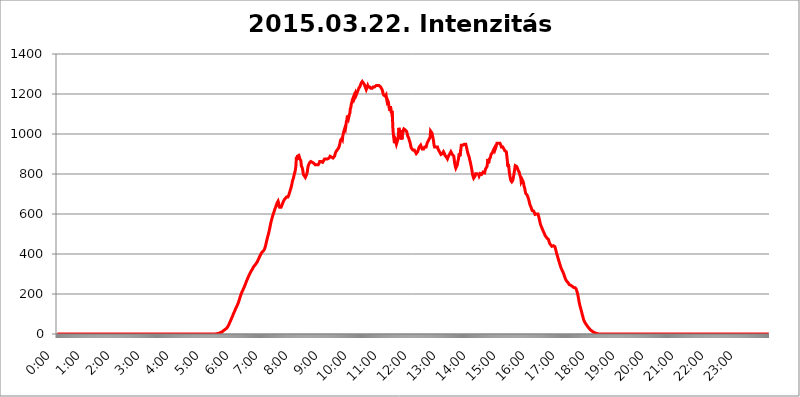
| Category | 2015.03.22. Intenzitás [W/m^2] |
|---|---|
| 0.0 | -0.256 |
| 0.0006944444444444445 | -0.256 |
| 0.001388888888888889 | -0.256 |
| 0.0020833333333333333 | -0.256 |
| 0.002777777777777778 | -0.256 |
| 0.003472222222222222 | -0.256 |
| 0.004166666666666667 | -0.256 |
| 0.004861111111111111 | -0.256 |
| 0.005555555555555556 | -0.256 |
| 0.0062499999999999995 | -0.256 |
| 0.006944444444444444 | -0.256 |
| 0.007638888888888889 | -0.256 |
| 0.008333333333333333 | -0.256 |
| 0.009027777777777779 | -0.256 |
| 0.009722222222222222 | -0.256 |
| 0.010416666666666666 | -0.256 |
| 0.011111111111111112 | -0.256 |
| 0.011805555555555555 | -0.256 |
| 0.012499999999999999 | -0.256 |
| 0.013194444444444444 | -0.256 |
| 0.013888888888888888 | -0.256 |
| 0.014583333333333332 | -0.256 |
| 0.015277777777777777 | -0.256 |
| 0.015972222222222224 | -0.256 |
| 0.016666666666666666 | -0.256 |
| 0.017361111111111112 | -0.256 |
| 0.018055555555555557 | -0.256 |
| 0.01875 | -0.256 |
| 0.019444444444444445 | -0.256 |
| 0.02013888888888889 | -0.256 |
| 0.020833333333333332 | -0.256 |
| 0.02152777777777778 | -0.256 |
| 0.022222222222222223 | -0.256 |
| 0.02291666666666667 | -0.256 |
| 0.02361111111111111 | -0.256 |
| 0.024305555555555556 | -0.256 |
| 0.024999999999999998 | -0.256 |
| 0.025694444444444447 | -0.256 |
| 0.02638888888888889 | -0.256 |
| 0.027083333333333334 | -0.256 |
| 0.027777777777777776 | -0.256 |
| 0.02847222222222222 | -0.256 |
| 0.029166666666666664 | -0.256 |
| 0.029861111111111113 | -0.256 |
| 0.030555555555555555 | -0.256 |
| 0.03125 | -0.256 |
| 0.03194444444444445 | -0.256 |
| 0.03263888888888889 | -0.256 |
| 0.03333333333333333 | -0.256 |
| 0.034027777777777775 | -0.256 |
| 0.034722222222222224 | -0.256 |
| 0.035416666666666666 | -0.256 |
| 0.036111111111111115 | -0.256 |
| 0.03680555555555556 | -0.256 |
| 0.0375 | -0.256 |
| 0.03819444444444444 | -0.256 |
| 0.03888888888888889 | -0.256 |
| 0.03958333333333333 | -0.256 |
| 0.04027777777777778 | -0.256 |
| 0.04097222222222222 | -0.256 |
| 0.041666666666666664 | -0.256 |
| 0.042361111111111106 | -0.256 |
| 0.04305555555555556 | -0.256 |
| 0.043750000000000004 | -0.256 |
| 0.044444444444444446 | -0.256 |
| 0.04513888888888889 | -0.256 |
| 0.04583333333333334 | -0.256 |
| 0.04652777777777778 | -0.256 |
| 0.04722222222222222 | -0.256 |
| 0.04791666666666666 | -0.256 |
| 0.04861111111111111 | -0.256 |
| 0.049305555555555554 | -0.256 |
| 0.049999999999999996 | -0.256 |
| 0.05069444444444445 | -0.256 |
| 0.051388888888888894 | -0.256 |
| 0.052083333333333336 | -0.256 |
| 0.05277777777777778 | -0.256 |
| 0.05347222222222222 | -0.256 |
| 0.05416666666666667 | -0.256 |
| 0.05486111111111111 | -0.256 |
| 0.05555555555555555 | -0.256 |
| 0.05625 | -0.256 |
| 0.05694444444444444 | -0.256 |
| 0.057638888888888885 | -0.256 |
| 0.05833333333333333 | -0.256 |
| 0.05902777777777778 | -0.256 |
| 0.059722222222222225 | -0.256 |
| 0.06041666666666667 | -0.256 |
| 0.061111111111111116 | -0.256 |
| 0.06180555555555556 | -0.256 |
| 0.0625 | -0.256 |
| 0.06319444444444444 | -0.256 |
| 0.06388888888888888 | -0.256 |
| 0.06458333333333334 | -0.256 |
| 0.06527777777777778 | -0.256 |
| 0.06597222222222222 | -0.256 |
| 0.06666666666666667 | -0.256 |
| 0.06736111111111111 | -0.256 |
| 0.06805555555555555 | -0.256 |
| 0.06874999999999999 | -0.256 |
| 0.06944444444444443 | -0.256 |
| 0.07013888888888889 | -0.256 |
| 0.07083333333333333 | -0.256 |
| 0.07152777777777779 | -0.256 |
| 0.07222222222222223 | -0.256 |
| 0.07291666666666667 | -0.256 |
| 0.07361111111111111 | -0.256 |
| 0.07430555555555556 | -0.256 |
| 0.075 | -0.256 |
| 0.07569444444444444 | -0.256 |
| 0.0763888888888889 | -0.256 |
| 0.07708333333333334 | -0.256 |
| 0.07777777777777778 | -0.256 |
| 0.07847222222222222 | -0.256 |
| 0.07916666666666666 | -0.256 |
| 0.0798611111111111 | -0.256 |
| 0.08055555555555556 | -0.256 |
| 0.08125 | -0.256 |
| 0.08194444444444444 | -0.256 |
| 0.08263888888888889 | -0.256 |
| 0.08333333333333333 | -0.256 |
| 0.08402777777777777 | -0.256 |
| 0.08472222222222221 | -0.256 |
| 0.08541666666666665 | -0.256 |
| 0.08611111111111112 | -0.256 |
| 0.08680555555555557 | -0.256 |
| 0.08750000000000001 | -0.256 |
| 0.08819444444444445 | -0.256 |
| 0.08888888888888889 | -0.256 |
| 0.08958333333333333 | -0.256 |
| 0.09027777777777778 | -0.256 |
| 0.09097222222222222 | -0.256 |
| 0.09166666666666667 | -0.256 |
| 0.09236111111111112 | -0.256 |
| 0.09305555555555556 | -0.256 |
| 0.09375 | -0.256 |
| 0.09444444444444444 | -0.256 |
| 0.09513888888888888 | -0.256 |
| 0.09583333333333333 | -0.256 |
| 0.09652777777777777 | -0.256 |
| 0.09722222222222222 | -0.256 |
| 0.09791666666666667 | -0.256 |
| 0.09861111111111111 | -0.256 |
| 0.09930555555555555 | -0.256 |
| 0.09999999999999999 | -0.256 |
| 0.10069444444444443 | -0.256 |
| 0.1013888888888889 | -0.256 |
| 0.10208333333333335 | -0.256 |
| 0.10277777777777779 | -0.256 |
| 0.10347222222222223 | -0.256 |
| 0.10416666666666667 | -0.256 |
| 0.10486111111111111 | -0.256 |
| 0.10555555555555556 | -0.256 |
| 0.10625 | -0.256 |
| 0.10694444444444444 | -0.256 |
| 0.1076388888888889 | -0.256 |
| 0.10833333333333334 | -0.256 |
| 0.10902777777777778 | -0.256 |
| 0.10972222222222222 | -0.256 |
| 0.1111111111111111 | -0.256 |
| 0.11180555555555556 | -0.256 |
| 0.11180555555555556 | -0.256 |
| 0.1125 | -0.256 |
| 0.11319444444444444 | -0.256 |
| 0.11388888888888889 | -0.256 |
| 0.11458333333333333 | -0.256 |
| 0.11527777777777777 | -0.256 |
| 0.11597222222222221 | -0.256 |
| 0.11666666666666665 | -0.256 |
| 0.1173611111111111 | -0.256 |
| 0.11805555555555557 | -0.256 |
| 0.11944444444444445 | -0.256 |
| 0.12013888888888889 | -0.256 |
| 0.12083333333333333 | -0.256 |
| 0.12152777777777778 | -0.256 |
| 0.12222222222222223 | -0.256 |
| 0.12291666666666667 | -0.256 |
| 0.12291666666666667 | -0.256 |
| 0.12361111111111112 | -0.256 |
| 0.12430555555555556 | -0.256 |
| 0.125 | -0.256 |
| 0.12569444444444444 | -0.256 |
| 0.12638888888888888 | -0.256 |
| 0.12708333333333333 | -0.256 |
| 0.16875 | -0.256 |
| 0.12847222222222224 | -0.256 |
| 0.12916666666666668 | -0.256 |
| 0.12986111111111112 | -0.256 |
| 0.13055555555555556 | -0.256 |
| 0.13125 | -0.256 |
| 0.13194444444444445 | -0.256 |
| 0.1326388888888889 | -0.256 |
| 0.13333333333333333 | -0.256 |
| 0.13402777777777777 | -0.256 |
| 0.13402777777777777 | -0.256 |
| 0.13472222222222222 | -0.256 |
| 0.13541666666666666 | -0.256 |
| 0.1361111111111111 | -0.256 |
| 0.13749999999999998 | -0.256 |
| 0.13819444444444443 | -0.256 |
| 0.1388888888888889 | -0.256 |
| 0.13958333333333334 | -0.256 |
| 0.14027777777777778 | -0.256 |
| 0.14097222222222222 | -0.256 |
| 0.14166666666666666 | -0.256 |
| 0.1423611111111111 | -0.256 |
| 0.14305555555555557 | -0.256 |
| 0.14375000000000002 | -0.256 |
| 0.14444444444444446 | -0.256 |
| 0.1451388888888889 | -0.256 |
| 0.1451388888888889 | -0.256 |
| 0.14652777777777778 | -0.256 |
| 0.14722222222222223 | -0.256 |
| 0.14791666666666667 | -0.256 |
| 0.1486111111111111 | -0.256 |
| 0.14930555555555555 | -0.256 |
| 0.15 | -0.256 |
| 0.15069444444444444 | -0.256 |
| 0.15138888888888888 | -0.256 |
| 0.15208333333333332 | -0.256 |
| 0.15277777777777776 | -0.256 |
| 0.15347222222222223 | -0.256 |
| 0.15416666666666667 | -0.256 |
| 0.15486111111111112 | -0.256 |
| 0.15555555555555556 | -0.256 |
| 0.15625 | -0.256 |
| 0.15694444444444444 | -0.256 |
| 0.15763888888888888 | -0.256 |
| 0.15833333333333333 | -0.256 |
| 0.15902777777777777 | -0.256 |
| 0.15972222222222224 | -0.256 |
| 0.16041666666666668 | -0.256 |
| 0.16111111111111112 | -0.256 |
| 0.16180555555555556 | -0.256 |
| 0.1625 | -0.256 |
| 0.16319444444444445 | -0.256 |
| 0.1638888888888889 | -0.256 |
| 0.16458333333333333 | -0.256 |
| 0.16527777777777777 | -0.256 |
| 0.16597222222222222 | -0.256 |
| 0.16666666666666666 | -0.256 |
| 0.1673611111111111 | -0.256 |
| 0.16805555555555554 | -0.256 |
| 0.16874999999999998 | -0.256 |
| 0.16944444444444443 | -0.256 |
| 0.17013888888888887 | -0.256 |
| 0.1708333333333333 | -0.256 |
| 0.17152777777777775 | -0.256 |
| 0.17222222222222225 | -0.256 |
| 0.1729166666666667 | -0.256 |
| 0.17361111111111113 | -0.256 |
| 0.17430555555555557 | -0.256 |
| 0.17500000000000002 | -0.256 |
| 0.17569444444444446 | -0.256 |
| 0.1763888888888889 | -0.256 |
| 0.17708333333333334 | -0.256 |
| 0.17777777777777778 | -0.256 |
| 0.17847222222222223 | -0.256 |
| 0.17916666666666667 | -0.256 |
| 0.1798611111111111 | -0.256 |
| 0.18055555555555555 | -0.256 |
| 0.18125 | -0.256 |
| 0.18194444444444444 | -0.256 |
| 0.1826388888888889 | -0.256 |
| 0.18333333333333335 | -0.256 |
| 0.1840277777777778 | -0.256 |
| 0.18472222222222223 | -0.256 |
| 0.18541666666666667 | -0.256 |
| 0.18611111111111112 | -0.256 |
| 0.18680555555555556 | -0.256 |
| 0.1875 | -0.256 |
| 0.18819444444444444 | -0.256 |
| 0.18888888888888888 | -0.256 |
| 0.18958333333333333 | -0.256 |
| 0.19027777777777777 | -0.256 |
| 0.1909722222222222 | -0.256 |
| 0.19166666666666665 | -0.256 |
| 0.19236111111111112 | -0.256 |
| 0.19305555555555554 | -0.256 |
| 0.19375 | -0.256 |
| 0.19444444444444445 | -0.256 |
| 0.1951388888888889 | -0.256 |
| 0.19583333333333333 | -0.256 |
| 0.19652777777777777 | -0.256 |
| 0.19722222222222222 | -0.256 |
| 0.19791666666666666 | -0.256 |
| 0.1986111111111111 | -0.256 |
| 0.19930555555555554 | -0.256 |
| 0.19999999999999998 | -0.256 |
| 0.20069444444444443 | -0.256 |
| 0.20138888888888887 | -0.256 |
| 0.2020833333333333 | -0.256 |
| 0.2027777777777778 | -0.256 |
| 0.2034722222222222 | -0.256 |
| 0.2041666666666667 | -0.256 |
| 0.20486111111111113 | -0.256 |
| 0.20555555555555557 | -0.256 |
| 0.20625000000000002 | -0.256 |
| 0.20694444444444446 | -0.256 |
| 0.2076388888888889 | -0.256 |
| 0.20833333333333334 | -0.256 |
| 0.20902777777777778 | -0.256 |
| 0.20972222222222223 | -0.256 |
| 0.21041666666666667 | -0.256 |
| 0.2111111111111111 | -0.256 |
| 0.21180555555555555 | -0.256 |
| 0.2125 | -0.256 |
| 0.21319444444444444 | -0.256 |
| 0.2138888888888889 | -0.256 |
| 0.21458333333333335 | -0.256 |
| 0.2152777777777778 | -0.256 |
| 0.21597222222222223 | -0.256 |
| 0.21666666666666667 | -0.256 |
| 0.21736111111111112 | -0.256 |
| 0.21805555555555556 | -0.256 |
| 0.21875 | -0.256 |
| 0.21944444444444444 | -0.256 |
| 0.22013888888888888 | -0.256 |
| 0.22083333333333333 | -0.256 |
| 0.22152777777777777 | -0.256 |
| 0.2222222222222222 | 1.09 |
| 0.22291666666666665 | 1.09 |
| 0.2236111111111111 | 1.09 |
| 0.22430555555555556 | 1.09 |
| 0.225 | 2.439 |
| 0.22569444444444445 | 2.439 |
| 0.2263888888888889 | 3.791 |
| 0.22708333333333333 | 3.791 |
| 0.22777777777777777 | 5.146 |
| 0.22847222222222222 | 6.503 |
| 0.22916666666666666 | 7.862 |
| 0.2298611111111111 | 9.225 |
| 0.23055555555555554 | 9.225 |
| 0.23124999999999998 | 10.589 |
| 0.23194444444444443 | 13.325 |
| 0.23263888888888887 | 14.696 |
| 0.2333333333333333 | 17.444 |
| 0.2340277777777778 | 18.822 |
| 0.2347222222222222 | 21.582 |
| 0.2354166666666667 | 22.965 |
| 0.23611111111111113 | 24.35 |
| 0.23680555555555557 | 27.124 |
| 0.23750000000000002 | 28.514 |
| 0.23819444444444446 | 31.297 |
| 0.2388888888888889 | 35.483 |
| 0.23958333333333334 | 39.68 |
| 0.24027777777777778 | 43.886 |
| 0.24097222222222223 | 48.1 |
| 0.24166666666666667 | 55.139 |
| 0.2423611111111111 | 60.778 |
| 0.24305555555555555 | 66.423 |
| 0.24375 | 72.069 |
| 0.24444444444444446 | 77.715 |
| 0.24513888888888888 | 83.356 |
| 0.24583333333333335 | 88.991 |
| 0.2465277777777778 | 96.022 |
| 0.24722222222222223 | 101.634 |
| 0.24791666666666667 | 107.232 |
| 0.24861111111111112 | 112.814 |
| 0.24930555555555556 | 118.378 |
| 0.25 | 125.304 |
| 0.25069444444444444 | 129.444 |
| 0.2513888888888889 | 134.943 |
| 0.2520833333333333 | 140.417 |
| 0.25277777777777777 | 145.865 |
| 0.2534722222222222 | 151.286 |
| 0.25416666666666665 | 159.364 |
| 0.2548611111111111 | 166.044 |
| 0.2555555555555556 | 173.996 |
| 0.25625000000000003 | 181.877 |
| 0.2569444444444445 | 189.685 |
| 0.2576388888888889 | 197.419 |
| 0.25833333333333336 | 203.807 |
| 0.2590277777777778 | 210.144 |
| 0.25972222222222224 | 215.177 |
| 0.2604166666666667 | 220.177 |
| 0.2611111111111111 | 225.146 |
| 0.26180555555555557 | 231.313 |
| 0.2625 | 237.433 |
| 0.26319444444444445 | 243.507 |
| 0.2638888888888889 | 249.538 |
| 0.26458333333333334 | 256.722 |
| 0.2652777777777778 | 262.666 |
| 0.2659722222222222 | 268.576 |
| 0.26666666666666666 | 274.454 |
| 0.2673611111111111 | 280.304 |
| 0.26805555555555555 | 286.13 |
| 0.26875 | 290.777 |
| 0.26944444444444443 | 296.571 |
| 0.2701388888888889 | 301.198 |
| 0.2708333333333333 | 306.974 |
| 0.27152777777777776 | 311.594 |
| 0.2722222222222222 | 316.215 |
| 0.27291666666666664 | 320.84 |
| 0.2736111111111111 | 324.314 |
| 0.2743055555555555 | 328.955 |
| 0.27499999999999997 | 333.608 |
| 0.27569444444444446 | 337.109 |
| 0.27638888888888885 | 340.62 |
| 0.27708333333333335 | 344.144 |
| 0.2777777777777778 | 346.501 |
| 0.27847222222222223 | 350.049 |
| 0.2791666666666667 | 353.613 |
| 0.2798611111111111 | 357.196 |
| 0.28055555555555556 | 360.798 |
| 0.28125 | 366.851 |
| 0.28194444444444444 | 371.742 |
| 0.2826388888888889 | 376.682 |
| 0.2833333333333333 | 382.93 |
| 0.28402777777777777 | 387.995 |
| 0.2847222222222222 | 393.122 |
| 0.28541666666666665 | 398.318 |
| 0.28611111111111115 | 403.587 |
| 0.28680555555555554 | 406.25 |
| 0.28750000000000003 | 410.283 |
| 0.2881944444444445 | 412.998 |
| 0.2888888888888889 | 414.364 |
| 0.28958333333333336 | 417.112 |
| 0.2902777777777778 | 421.278 |
| 0.29097222222222224 | 426.916 |
| 0.2916666666666667 | 435.566 |
| 0.2923611111111111 | 444.463 |
| 0.29305555555555557 | 455.184 |
| 0.29375 | 466.302 |
| 0.29444444444444445 | 476.176 |
| 0.2951388888888889 | 486.389 |
| 0.29583333333333334 | 495.176 |
| 0.2965277777777778 | 504.229 |
| 0.2972222222222222 | 515.462 |
| 0.29791666666666666 | 527.122 |
| 0.2986111111111111 | 539.234 |
| 0.29930555555555555 | 551.823 |
| 0.3 | 562.699 |
| 0.30069444444444443 | 571.661 |
| 0.3013888888888889 | 580.866 |
| 0.3020833333333333 | 590.321 |
| 0.30277777777777776 | 597.582 |
| 0.3034722222222222 | 604.992 |
| 0.30416666666666664 | 612.554 |
| 0.3048611111111111 | 620.273 |
| 0.3055555555555555 | 628.152 |
| 0.30624999999999997 | 633.495 |
| 0.3069444444444444 | 641.649 |
| 0.3076388888888889 | 647.179 |
| 0.30833333333333335 | 655.618 |
| 0.3090277777777778 | 658.471 |
| 0.30972222222222223 | 664.234 |
| 0.3104166666666667 | 655.618 |
| 0.3111111111111111 | 638.912 |
| 0.31180555555555556 | 633.495 |
| 0.3125 | 630.814 |
| 0.31319444444444444 | 630.814 |
| 0.3138888888888889 | 633.495 |
| 0.3145833333333333 | 638.912 |
| 0.31527777777777777 | 644.405 |
| 0.3159722222222222 | 652.786 |
| 0.31666666666666665 | 658.471 |
| 0.31736111111111115 | 664.234 |
| 0.31805555555555554 | 667.146 |
| 0.31875000000000003 | 673.03 |
| 0.3194444444444445 | 676.003 |
| 0.3201388888888889 | 678.997 |
| 0.32083333333333336 | 682.011 |
| 0.3215277777777778 | 685.046 |
| 0.32222222222222224 | 682.011 |
| 0.3229166666666667 | 682.011 |
| 0.3236111111111111 | 685.046 |
| 0.32430555555555557 | 691.18 |
| 0.325 | 697.399 |
| 0.32569444444444445 | 706.89 |
| 0.3263888888888889 | 713.328 |
| 0.32708333333333334 | 723.153 |
| 0.3277777777777778 | 729.817 |
| 0.3284722222222222 | 739.988 |
| 0.32916666666666666 | 750.371 |
| 0.3298611111111111 | 764.555 |
| 0.33055555555555555 | 771.794 |
| 0.33125 | 779.134 |
| 0.33194444444444443 | 790.334 |
| 0.3326388888888889 | 801.768 |
| 0.3333333333333333 | 809.522 |
| 0.3340277777777778 | 821.353 |
| 0.3347222222222222 | 841.619 |
| 0.3354166666666667 | 884.274 |
| 0.3361111111111111 | 871.173 |
| 0.3368055555555556 | 888.701 |
| 0.33749999999999997 | 888.701 |
| 0.33819444444444446 | 893.157 |
| 0.33888888888888885 | 893.157 |
| 0.33958333333333335 | 884.274 |
| 0.34027777777777773 | 875.511 |
| 0.34097222222222223 | 871.173 |
| 0.3416666666666666 | 866.865 |
| 0.3423611111111111 | 841.619 |
| 0.3430555555555555 | 845.755 |
| 0.34375 | 829.377 |
| 0.3444444444444445 | 817.382 |
| 0.3451388888888889 | 797.931 |
| 0.3458333333333334 | 794.119 |
| 0.34652777777777777 | 790.334 |
| 0.34722222222222227 | 786.575 |
| 0.34791666666666665 | 782.842 |
| 0.34861111111111115 | 786.575 |
| 0.34930555555555554 | 794.119 |
| 0.35000000000000003 | 797.931 |
| 0.3506944444444444 | 809.522 |
| 0.3513888888888889 | 829.377 |
| 0.3520833333333333 | 841.619 |
| 0.3527777777777778 | 845.755 |
| 0.3534722222222222 | 854.113 |
| 0.3541666666666667 | 854.113 |
| 0.3548611111111111 | 858.335 |
| 0.35555555555555557 | 862.585 |
| 0.35625 | 858.335 |
| 0.35694444444444445 | 862.585 |
| 0.3576388888888889 | 858.335 |
| 0.35833333333333334 | 854.113 |
| 0.3590277777777778 | 854.113 |
| 0.3597222222222222 | 854.113 |
| 0.36041666666666666 | 849.92 |
| 0.3611111111111111 | 849.92 |
| 0.36180555555555555 | 845.755 |
| 0.3625 | 841.619 |
| 0.36319444444444443 | 841.619 |
| 0.3638888888888889 | 845.755 |
| 0.3645833333333333 | 841.619 |
| 0.3652777777777778 | 841.619 |
| 0.3659722222222222 | 845.755 |
| 0.3666666666666667 | 841.619 |
| 0.3673611111111111 | 854.113 |
| 0.3680555555555556 | 862.585 |
| 0.36874999999999997 | 858.335 |
| 0.36944444444444446 | 862.585 |
| 0.37013888888888885 | 862.585 |
| 0.37083333333333335 | 858.335 |
| 0.37152777777777773 | 858.335 |
| 0.37222222222222223 | 858.335 |
| 0.3729166666666666 | 862.585 |
| 0.3736111111111111 | 866.865 |
| 0.3743055555555555 | 871.173 |
| 0.375 | 875.511 |
| 0.3756944444444445 | 875.511 |
| 0.3763888888888889 | 879.878 |
| 0.3770833333333334 | 875.511 |
| 0.37777777777777777 | 875.511 |
| 0.37847222222222227 | 875.511 |
| 0.37916666666666665 | 875.511 |
| 0.37986111111111115 | 875.511 |
| 0.38055555555555554 | 875.511 |
| 0.38125000000000003 | 879.878 |
| 0.3819444444444444 | 884.274 |
| 0.3826388888888889 | 888.701 |
| 0.3833333333333333 | 888.701 |
| 0.3840277777777778 | 888.701 |
| 0.3847222222222222 | 884.274 |
| 0.3854166666666667 | 888.701 |
| 0.3861111111111111 | 884.274 |
| 0.38680555555555557 | 879.878 |
| 0.3875 | 879.878 |
| 0.38819444444444445 | 884.274 |
| 0.3888888888888889 | 888.701 |
| 0.38958333333333334 | 897.643 |
| 0.3902777777777778 | 906.707 |
| 0.3909722222222222 | 911.285 |
| 0.39166666666666666 | 915.893 |
| 0.3923611111111111 | 920.533 |
| 0.39305555555555555 | 920.533 |
| 0.39375 | 925.203 |
| 0.39444444444444443 | 929.905 |
| 0.3951388888888889 | 934.639 |
| 0.3958333333333333 | 939.404 |
| 0.3965277777777778 | 953.892 |
| 0.3972222222222222 | 968.671 |
| 0.3979166666666667 | 973.663 |
| 0.3986111111111111 | 973.663 |
| 0.3993055555555556 | 978.688 |
| 0.39999999999999997 | 973.663 |
| 0.40069444444444446 | 993.965 |
| 0.40138888888888885 | 1004.318 |
| 0.40208333333333335 | 1014.809 |
| 0.40277777777777773 | 1014.809 |
| 0.40347222222222223 | 1030.804 |
| 0.4041666666666666 | 1025.437 |
| 0.4048611111111111 | 1041.644 |
| 0.4055555555555555 | 1063.751 |
| 0.40625 | 1069.368 |
| 0.4069444444444445 | 1092.203 |
| 0.4076388888888889 | 1080.711 |
| 0.4083333333333334 | 1075.021 |
| 0.40902777777777777 | 1086.439 |
| 0.40972222222222227 | 1098.004 |
| 0.41041666666666665 | 1103.843 |
| 0.41111111111111115 | 1127.578 |
| 0.41180555555555554 | 1133.607 |
| 0.41250000000000003 | 1151.928 |
| 0.4131944444444444 | 1158.113 |
| 0.4138888888888889 | 1170.601 |
| 0.4145833333333333 | 1176.905 |
| 0.4152777777777778 | 1176.905 |
| 0.4159722222222222 | 1189.633 |
| 0.4166666666666667 | 1176.905 |
| 0.4173611111111111 | 1183.249 |
| 0.41805555555555557 | 1189.633 |
| 0.41875 | 1202.523 |
| 0.41944444444444445 | 1196.058 |
| 0.4201388888888889 | 1196.058 |
| 0.42083333333333334 | 1209.029 |
| 0.4215277777777778 | 1215.576 |
| 0.4222222222222222 | 1215.576 |
| 0.42291666666666666 | 1228.794 |
| 0.4236111111111111 | 1228.794 |
| 0.42430555555555555 | 1235.465 |
| 0.425 | 1235.465 |
| 0.42569444444444443 | 1248.934 |
| 0.4263888888888889 | 1255.731 |
| 0.4270833333333333 | 1255.731 |
| 0.4277777777777778 | 1262.571 |
| 0.4284722222222222 | 1262.571 |
| 0.4291666666666667 | 1255.731 |
| 0.4298611111111111 | 1255.731 |
| 0.4305555555555556 | 1248.934 |
| 0.43124999999999997 | 1242.179 |
| 0.43194444444444446 | 1242.179 |
| 0.43263888888888885 | 1228.794 |
| 0.43333333333333335 | 1222.164 |
| 0.43402777777777773 | 1228.794 |
| 0.43472222222222223 | 1235.465 |
| 0.4354166666666666 | 1242.179 |
| 0.4361111111111111 | 1235.465 |
| 0.4368055555555555 | 1235.465 |
| 0.4375 | 1235.465 |
| 0.4381944444444445 | 1235.465 |
| 0.4388888888888889 | 1235.465 |
| 0.4395833333333334 | 1228.794 |
| 0.44027777777777777 | 1228.794 |
| 0.44097222222222227 | 1228.794 |
| 0.44166666666666665 | 1228.794 |
| 0.44236111111111115 | 1228.794 |
| 0.44305555555555554 | 1235.465 |
| 0.44375000000000003 | 1235.465 |
| 0.4444444444444444 | 1235.465 |
| 0.4451388888888889 | 1235.465 |
| 0.4458333333333333 | 1235.465 |
| 0.4465277777777778 | 1235.465 |
| 0.4472222222222222 | 1242.179 |
| 0.4479166666666667 | 1242.179 |
| 0.4486111111111111 | 1242.179 |
| 0.44930555555555557 | 1242.179 |
| 0.45 | 1242.179 |
| 0.45069444444444445 | 1242.179 |
| 0.4513888888888889 | 1242.179 |
| 0.45208333333333334 | 1242.179 |
| 0.4527777777777778 | 1242.179 |
| 0.4534722222222222 | 1235.465 |
| 0.45416666666666666 | 1235.465 |
| 0.4548611111111111 | 1235.465 |
| 0.45555555555555555 | 1222.164 |
| 0.45625 | 1215.576 |
| 0.45694444444444443 | 1202.523 |
| 0.4576388888888889 | 1196.058 |
| 0.4583333333333333 | 1196.058 |
| 0.4590277777777778 | 1196.058 |
| 0.4597222222222222 | 1189.633 |
| 0.4604166666666667 | 1189.633 |
| 0.4611111111111111 | 1196.058 |
| 0.4618055555555556 | 1176.905 |
| 0.46249999999999997 | 1164.337 |
| 0.46319444444444446 | 1170.601 |
| 0.46388888888888885 | 1170.601 |
| 0.46458333333333335 | 1158.113 |
| 0.46527777777777773 | 1133.607 |
| 0.46597222222222223 | 1127.578 |
| 0.4666666666666666 | 1115.634 |
| 0.4673611111111111 | 1139.675 |
| 0.4680555555555555 | 1115.634 |
| 0.46875 | 1103.843 |
| 0.4694444444444445 | 1115.634 |
| 0.4701388888888889 | 1080.711 |
| 0.4708333333333334 | 1020.106 |
| 0.47152777777777777 | 993.965 |
| 0.47222222222222227 | 973.663 |
| 0.47291666666666665 | 953.892 |
| 0.47361111111111115 | 958.785 |
| 0.47430555555555554 | 968.671 |
| 0.47500000000000003 | 963.712 |
| 0.4756944444444444 | 949.03 |
| 0.4763888888888889 | 953.892 |
| 0.4770833333333333 | 944.201 |
| 0.4777777777777778 | 973.663 |
| 0.4784722222222222 | 993.965 |
| 0.4791666666666667 | 1030.804 |
| 0.4798611111111111 | 1014.809 |
| 0.48055555555555557 | 978.688 |
| 0.48125 | 1020.106 |
| 0.48194444444444445 | 973.663 |
| 0.4826388888888889 | 993.965 |
| 0.48333333333333334 | 973.663 |
| 0.4840277777777778 | 993.965 |
| 0.4847222222222222 | 1004.318 |
| 0.48541666666666666 | 1020.106 |
| 0.4861111111111111 | 1025.437 |
| 0.48680555555555555 | 1025.437 |
| 0.4875 | 1025.437 |
| 0.48819444444444443 | 1020.106 |
| 0.4888888888888889 | 1020.106 |
| 0.4895833333333333 | 1014.809 |
| 0.4902777777777778 | 1009.546 |
| 0.4909722222222222 | 999.125 |
| 0.4916666666666667 | 988.839 |
| 0.4923611111111111 | 983.747 |
| 0.4930555555555556 | 978.688 |
| 0.49374999999999997 | 968.671 |
| 0.49444444444444446 | 963.712 |
| 0.49513888888888885 | 953.892 |
| 0.49583333333333335 | 939.404 |
| 0.49652777777777773 | 929.905 |
| 0.49722222222222223 | 929.905 |
| 0.4979166666666666 | 925.203 |
| 0.4986111111111111 | 920.533 |
| 0.4993055555555555 | 915.893 |
| 0.5 | 915.893 |
| 0.5006944444444444 | 920.533 |
| 0.5013888888888889 | 915.893 |
| 0.5020833333333333 | 911.285 |
| 0.5027777777777778 | 906.707 |
| 0.5034722222222222 | 902.16 |
| 0.5041666666666667 | 902.16 |
| 0.5048611111111111 | 902.16 |
| 0.5055555555555555 | 911.285 |
| 0.50625 | 920.533 |
| 0.5069444444444444 | 925.203 |
| 0.5076388888888889 | 934.639 |
| 0.5083333333333333 | 929.905 |
| 0.5090277777777777 | 939.404 |
| 0.5097222222222222 | 944.201 |
| 0.5104166666666666 | 944.201 |
| 0.5111111111111112 | 939.404 |
| 0.5118055555555555 | 925.203 |
| 0.5125000000000001 | 920.533 |
| 0.5131944444444444 | 920.533 |
| 0.513888888888889 | 925.203 |
| 0.5145833333333333 | 925.203 |
| 0.5152777777777778 | 934.639 |
| 0.5159722222222222 | 939.404 |
| 0.5166666666666667 | 939.404 |
| 0.517361111111111 | 934.639 |
| 0.5180555555555556 | 944.201 |
| 0.5187499999999999 | 953.892 |
| 0.5194444444444445 | 953.892 |
| 0.5201388888888888 | 963.712 |
| 0.5208333333333334 | 963.712 |
| 0.5215277777777778 | 973.663 |
| 0.5222222222222223 | 978.688 |
| 0.5229166666666667 | 983.747 |
| 0.5236111111111111 | 1014.809 |
| 0.5243055555555556 | 1014.809 |
| 0.525 | 1014.809 |
| 0.5256944444444445 | 1004.318 |
| 0.5263888888888889 | 988.839 |
| 0.5270833333333333 | 978.688 |
| 0.5277777777777778 | 963.712 |
| 0.5284722222222222 | 944.201 |
| 0.5291666666666667 | 934.639 |
| 0.5298611111111111 | 934.639 |
| 0.5305555555555556 | 934.639 |
| 0.53125 | 934.639 |
| 0.5319444444444444 | 929.905 |
| 0.5326388888888889 | 929.905 |
| 0.5333333333333333 | 934.639 |
| 0.5340277777777778 | 925.203 |
| 0.5347222222222222 | 920.533 |
| 0.5354166666666667 | 915.893 |
| 0.5361111111111111 | 911.285 |
| 0.5368055555555555 | 906.707 |
| 0.5375 | 902.16 |
| 0.5381944444444444 | 897.643 |
| 0.5388888888888889 | 897.643 |
| 0.5395833333333333 | 897.643 |
| 0.5402777777777777 | 902.16 |
| 0.5409722222222222 | 906.707 |
| 0.5416666666666666 | 911.285 |
| 0.5423611111111112 | 911.285 |
| 0.5430555555555555 | 902.16 |
| 0.5437500000000001 | 893.157 |
| 0.5444444444444444 | 893.157 |
| 0.545138888888889 | 888.701 |
| 0.5458333333333333 | 884.274 |
| 0.5465277777777778 | 884.274 |
| 0.5472222222222222 | 875.511 |
| 0.5479166666666667 | 879.878 |
| 0.548611111111111 | 888.701 |
| 0.5493055555555556 | 893.157 |
| 0.5499999999999999 | 897.643 |
| 0.5506944444444445 | 897.643 |
| 0.5513888888888888 | 902.16 |
| 0.5520833333333334 | 911.285 |
| 0.5527777777777778 | 911.285 |
| 0.5534722222222223 | 911.285 |
| 0.5541666666666667 | 897.643 |
| 0.5548611111111111 | 893.157 |
| 0.5555555555555556 | 897.643 |
| 0.55625 | 888.701 |
| 0.5569444444444445 | 866.865 |
| 0.5576388888888889 | 849.92 |
| 0.5583333333333333 | 837.51 |
| 0.5590277777777778 | 829.377 |
| 0.5597222222222222 | 825.351 |
| 0.5604166666666667 | 833.43 |
| 0.5611111111111111 | 845.755 |
| 0.5618055555555556 | 862.585 |
| 0.5625 | 871.173 |
| 0.5631944444444444 | 888.701 |
| 0.5638888888888889 | 902.16 |
| 0.5645833333333333 | 888.701 |
| 0.5652777777777778 | 893.157 |
| 0.5659722222222222 | 920.533 |
| 0.5666666666666667 | 944.201 |
| 0.5673611111111111 | 944.201 |
| 0.5680555555555555 | 939.404 |
| 0.56875 | 944.201 |
| 0.5694444444444444 | 949.03 |
| 0.5701388888888889 | 949.03 |
| 0.5708333333333333 | 949.03 |
| 0.5715277777777777 | 953.892 |
| 0.5722222222222222 | 949.03 |
| 0.5729166666666666 | 949.03 |
| 0.5736111111111112 | 944.201 |
| 0.5743055555555555 | 929.905 |
| 0.5750000000000001 | 915.893 |
| 0.5756944444444444 | 911.285 |
| 0.576388888888889 | 897.643 |
| 0.5770833333333333 | 897.643 |
| 0.5777777777777778 | 884.274 |
| 0.5784722222222222 | 871.173 |
| 0.5791666666666667 | 862.585 |
| 0.579861111111111 | 849.92 |
| 0.5805555555555556 | 837.51 |
| 0.5812499999999999 | 825.351 |
| 0.5819444444444445 | 809.522 |
| 0.5826388888888888 | 794.119 |
| 0.5833333333333334 | 786.575 |
| 0.5840277777777778 | 779.134 |
| 0.5847222222222223 | 779.134 |
| 0.5854166666666667 | 782.842 |
| 0.5861111111111111 | 790.334 |
| 0.5868055555555556 | 801.768 |
| 0.5875 | 801.768 |
| 0.5881944444444445 | 801.768 |
| 0.5888888888888889 | 801.768 |
| 0.5895833333333333 | 801.768 |
| 0.5902777777777778 | 797.931 |
| 0.5909722222222222 | 797.931 |
| 0.5916666666666667 | 790.334 |
| 0.5923611111111111 | 794.119 |
| 0.5930555555555556 | 801.768 |
| 0.59375 | 801.768 |
| 0.5944444444444444 | 797.931 |
| 0.5951388888888889 | 797.931 |
| 0.5958333333333333 | 801.768 |
| 0.5965277777777778 | 801.768 |
| 0.5972222222222222 | 809.522 |
| 0.5979166666666667 | 805.632 |
| 0.5986111111111111 | 805.632 |
| 0.5993055555555555 | 805.632 |
| 0.6 | 805.632 |
| 0.6006944444444444 | 825.351 |
| 0.6013888888888889 | 829.377 |
| 0.6020833333333333 | 825.351 |
| 0.6027777777777777 | 837.51 |
| 0.6034722222222222 | 841.619 |
| 0.6041666666666666 | 875.511 |
| 0.6048611111111112 | 854.113 |
| 0.6055555555555555 | 862.585 |
| 0.6062500000000001 | 875.511 |
| 0.6069444444444444 | 879.878 |
| 0.607638888888889 | 884.274 |
| 0.6083333333333333 | 897.643 |
| 0.6090277777777778 | 897.643 |
| 0.6097222222222222 | 902.16 |
| 0.6104166666666667 | 906.707 |
| 0.611111111111111 | 915.893 |
| 0.6118055555555556 | 911.285 |
| 0.6124999999999999 | 920.533 |
| 0.6131944444444445 | 929.905 |
| 0.6138888888888888 | 920.533 |
| 0.6145833333333334 | 925.203 |
| 0.6152777777777778 | 934.639 |
| 0.6159722222222223 | 944.201 |
| 0.6166666666666667 | 953.892 |
| 0.6173611111111111 | 953.892 |
| 0.6180555555555556 | 953.892 |
| 0.61875 | 953.892 |
| 0.6194444444444445 | 949.03 |
| 0.6201388888888889 | 953.892 |
| 0.6208333333333333 | 953.892 |
| 0.6215277777777778 | 949.03 |
| 0.6222222222222222 | 944.201 |
| 0.6229166666666667 | 934.639 |
| 0.6236111111111111 | 934.639 |
| 0.6243055555555556 | 934.639 |
| 0.625 | 934.639 |
| 0.6256944444444444 | 929.905 |
| 0.6263888888888889 | 925.203 |
| 0.6270833333333333 | 920.533 |
| 0.6277777777777778 | 915.893 |
| 0.6284722222222222 | 915.893 |
| 0.6291666666666667 | 915.893 |
| 0.6298611111111111 | 911.285 |
| 0.6305555555555555 | 888.701 |
| 0.63125 | 866.865 |
| 0.6319444444444444 | 837.51 |
| 0.6326388888888889 | 849.92 |
| 0.6333333333333333 | 833.43 |
| 0.6340277777777777 | 809.522 |
| 0.6347222222222222 | 794.119 |
| 0.6354166666666666 | 779.134 |
| 0.6361111111111112 | 768.162 |
| 0.6368055555555555 | 764.555 |
| 0.6375000000000001 | 760.972 |
| 0.6381944444444444 | 760.972 |
| 0.638888888888889 | 768.162 |
| 0.6395833333333333 | 779.134 |
| 0.6402777777777778 | 794.119 |
| 0.6409722222222222 | 809.522 |
| 0.6416666666666667 | 825.351 |
| 0.642361111111111 | 841.619 |
| 0.6430555555555556 | 841.619 |
| 0.6437499999999999 | 837.51 |
| 0.6444444444444445 | 837.51 |
| 0.6451388888888888 | 833.43 |
| 0.6458333333333334 | 825.351 |
| 0.6465277777777778 | 817.382 |
| 0.6472222222222223 | 813.439 |
| 0.6479166666666667 | 809.522 |
| 0.6486111111111111 | 797.931 |
| 0.6493055555555556 | 790.334 |
| 0.65 | 782.842 |
| 0.6506944444444445 | 760.972 |
| 0.6513888888888889 | 760.972 |
| 0.6520833333333333 | 771.794 |
| 0.6527777777777778 | 768.162 |
| 0.6534722222222222 | 760.972 |
| 0.6541666666666667 | 750.371 |
| 0.6548611111111111 | 736.574 |
| 0.6555555555555556 | 729.817 |
| 0.65625 | 716.58 |
| 0.6569444444444444 | 703.704 |
| 0.6576388888888889 | 700.54 |
| 0.6583333333333333 | 700.54 |
| 0.6590277777777778 | 694.278 |
| 0.6597222222222222 | 688.102 |
| 0.6604166666666667 | 682.011 |
| 0.6611111111111111 | 673.03 |
| 0.6618055555555555 | 664.234 |
| 0.6625 | 652.786 |
| 0.6631944444444444 | 644.405 |
| 0.6638888888888889 | 638.912 |
| 0.6645833333333333 | 633.495 |
| 0.6652777777777777 | 625.508 |
| 0.6659722222222222 | 617.682 |
| 0.6666666666666666 | 615.11 |
| 0.6673611111111111 | 615.11 |
| 0.6680555555555556 | 615.11 |
| 0.6687500000000001 | 610.016 |
| 0.6694444444444444 | 604.992 |
| 0.6701388888888888 | 597.582 |
| 0.6708333333333334 | 595.145 |
| 0.6715277777777778 | 595.145 |
| 0.6722222222222222 | 600.035 |
| 0.6729166666666666 | 602.505 |
| 0.6736111111111112 | 604.992 |
| 0.6743055555555556 | 600.035 |
| 0.6749999999999999 | 590.321 |
| 0.6756944444444444 | 580.866 |
| 0.6763888888888889 | 569.398 |
| 0.6770833333333334 | 558.305 |
| 0.6777777777777777 | 547.572 |
| 0.6784722222222223 | 541.298 |
| 0.6791666666666667 | 535.145 |
| 0.6798611111111111 | 529.108 |
| 0.6805555555555555 | 523.186 |
| 0.68125 | 517.375 |
| 0.6819444444444445 | 511.671 |
| 0.6826388888888889 | 506.072 |
| 0.6833333333333332 | 500.575 |
| 0.6840277777777778 | 493.398 |
| 0.6847222222222222 | 489.873 |
| 0.6854166666666667 | 486.389 |
| 0.686111111111111 | 482.945 |
| 0.6868055555555556 | 479.541 |
| 0.6875 | 477.854 |
| 0.6881944444444444 | 477.854 |
| 0.688888888888889 | 472.848 |
| 0.6895833333333333 | 464.688 |
| 0.6902777777777778 | 456.747 |
| 0.6909722222222222 | 450.542 |
| 0.6916666666666668 | 447.487 |
| 0.6923611111111111 | 444.463 |
| 0.6930555555555555 | 441.469 |
| 0.69375 | 438.503 |
| 0.6944444444444445 | 438.503 |
| 0.6951388888888889 | 439.982 |
| 0.6958333333333333 | 441.469 |
| 0.6965277777777777 | 442.962 |
| 0.6972222222222223 | 441.469 |
| 0.6979166666666666 | 437.031 |
| 0.6986111111111111 | 428.341 |
| 0.6993055555555556 | 418.495 |
| 0.7000000000000001 | 408.934 |
| 0.7006944444444444 | 399.628 |
| 0.7013888888888888 | 391.834 |
| 0.7020833333333334 | 382.93 |
| 0.7027777777777778 | 374.206 |
| 0.7034722222222222 | 365.635 |
| 0.7041666666666666 | 358.394 |
| 0.7048611111111112 | 350.049 |
| 0.7055555555555556 | 341.794 |
| 0.7062499999999999 | 333.608 |
| 0.7069444444444444 | 327.793 |
| 0.7076388888888889 | 321.998 |
| 0.7083333333333334 | 317.371 |
| 0.7090277777777777 | 311.594 |
| 0.7097222222222223 | 305.819 |
| 0.7104166666666667 | 300.041 |
| 0.7111111111111111 | 291.937 |
| 0.7118055555555555 | 284.967 |
| 0.7125 | 277.967 |
| 0.7131944444444445 | 272.106 |
| 0.7138888888888889 | 267.396 |
| 0.7145833333333332 | 263.851 |
| 0.7152777777777778 | 261.48 |
| 0.7159722222222222 | 259.104 |
| 0.7166666666666667 | 255.528 |
| 0.717361111111111 | 250.739 |
| 0.7180555555555556 | 247.131 |
| 0.71875 | 244.717 |
| 0.7194444444444444 | 243.507 |
| 0.720138888888889 | 243.507 |
| 0.7208333333333333 | 242.296 |
| 0.7215277777777778 | 241.083 |
| 0.7222222222222222 | 238.651 |
| 0.7229166666666668 | 236.212 |
| 0.7236111111111111 | 234.99 |
| 0.7243055555555555 | 232.54 |
| 0.725 | 232.54 |
| 0.7256944444444445 | 231.313 |
| 0.7263888888888889 | 231.313 |
| 0.7270833333333333 | 228.852 |
| 0.7277777777777777 | 225.146 |
| 0.7284722222222223 | 217.681 |
| 0.7291666666666666 | 210.144 |
| 0.7298611111111111 | 199.98 |
| 0.7305555555555556 | 188.389 |
| 0.7312500000000001 | 173.996 |
| 0.7319444444444444 | 159.364 |
| 0.7326388888888888 | 148.579 |
| 0.7333333333333334 | 137.683 |
| 0.7340277777777778 | 129.444 |
| 0.7347222222222222 | 119.766 |
| 0.7354166666666666 | 111.42 |
| 0.7361111111111112 | 100.233 |
| 0.7368055555555556 | 91.806 |
| 0.7374999999999999 | 81.946 |
| 0.7381944444444444 | 73.481 |
| 0.7388888888888889 | 66.423 |
| 0.7395833333333334 | 60.778 |
| 0.7402777777777777 | 56.548 |
| 0.7409722222222223 | 52.322 |
| 0.7416666666666667 | 48.1 |
| 0.7423611111111111 | 45.29 |
| 0.7430555555555555 | 42.483 |
| 0.74375 | 38.28 |
| 0.7444444444444445 | 34.086 |
| 0.7451388888888889 | 31.297 |
| 0.7458333333333332 | 28.514 |
| 0.7465277777777778 | 25.736 |
| 0.7472222222222222 | 22.965 |
| 0.7479166666666667 | 20.201 |
| 0.748611111111111 | 18.822 |
| 0.7493055555555556 | 16.069 |
| 0.75 | 14.696 |
| 0.7506944444444444 | 11.956 |
| 0.751388888888889 | 10.589 |
| 0.7520833333333333 | 9.225 |
| 0.7527777777777778 | 7.862 |
| 0.7534722222222222 | 6.503 |
| 0.7541666666666668 | 5.146 |
| 0.7548611111111111 | 5.146 |
| 0.7555555555555555 | 3.791 |
| 0.75625 | 3.791 |
| 0.7569444444444445 | 2.439 |
| 0.7576388888888889 | 1.09 |
| 0.7583333333333333 | 1.09 |
| 0.7590277777777777 | 1.09 |
| 0.7597222222222223 | 1.09 |
| 0.7604166666666666 | -0.256 |
| 0.7611111111111111 | -0.256 |
| 0.7618055555555556 | -0.256 |
| 0.7625000000000001 | -0.256 |
| 0.7631944444444444 | -0.256 |
| 0.7638888888888888 | -0.256 |
| 0.7645833333333334 | -0.256 |
| 0.7652777777777778 | -0.256 |
| 0.7659722222222222 | -0.256 |
| 0.7666666666666666 | -0.256 |
| 0.7673611111111112 | -0.256 |
| 0.7680555555555556 | -0.256 |
| 0.7687499999999999 | -0.256 |
| 0.7694444444444444 | -0.256 |
| 0.7701388888888889 | -0.256 |
| 0.7708333333333334 | -0.256 |
| 0.7715277777777777 | -0.256 |
| 0.7722222222222223 | -0.256 |
| 0.7729166666666667 | -0.256 |
| 0.7736111111111111 | -0.256 |
| 0.7743055555555555 | -0.256 |
| 0.775 | -0.256 |
| 0.7756944444444445 | -0.256 |
| 0.7763888888888889 | -0.256 |
| 0.7770833333333332 | -0.256 |
| 0.7777777777777778 | -0.256 |
| 0.7784722222222222 | -0.256 |
| 0.7791666666666667 | -0.256 |
| 0.779861111111111 | -0.256 |
| 0.7805555555555556 | -0.256 |
| 0.78125 | -0.256 |
| 0.7819444444444444 | -0.256 |
| 0.782638888888889 | -0.256 |
| 0.7833333333333333 | -0.256 |
| 0.7840277777777778 | -0.256 |
| 0.7847222222222222 | -0.256 |
| 0.7854166666666668 | -0.256 |
| 0.7861111111111111 | -0.256 |
| 0.7868055555555555 | -0.256 |
| 0.7875 | -0.256 |
| 0.7881944444444445 | -0.256 |
| 0.7888888888888889 | -0.256 |
| 0.7895833333333333 | -0.256 |
| 0.7902777777777777 | -0.256 |
| 0.7909722222222223 | -0.256 |
| 0.7916666666666666 | -0.256 |
| 0.7923611111111111 | -0.256 |
| 0.7930555555555556 | -0.256 |
| 0.7937500000000001 | -0.256 |
| 0.7944444444444444 | -0.256 |
| 0.7951388888888888 | -0.256 |
| 0.7958333333333334 | -0.256 |
| 0.7965277777777778 | -0.256 |
| 0.7972222222222222 | -0.256 |
| 0.7979166666666666 | -0.256 |
| 0.7986111111111112 | -0.256 |
| 0.7993055555555556 | -0.256 |
| 0.7999999999999999 | -0.256 |
| 0.8006944444444444 | -0.256 |
| 0.8013888888888889 | -0.256 |
| 0.8020833333333334 | -0.256 |
| 0.8027777777777777 | -0.256 |
| 0.8034722222222223 | -0.256 |
| 0.8041666666666667 | -0.256 |
| 0.8048611111111111 | -0.256 |
| 0.8055555555555555 | -0.256 |
| 0.80625 | -0.256 |
| 0.8069444444444445 | -0.256 |
| 0.8076388888888889 | -0.256 |
| 0.8083333333333332 | -0.256 |
| 0.8090277777777778 | -0.256 |
| 0.8097222222222222 | -0.256 |
| 0.8104166666666667 | -0.256 |
| 0.811111111111111 | -0.256 |
| 0.8118055555555556 | -0.256 |
| 0.8125 | -0.256 |
| 0.8131944444444444 | -0.256 |
| 0.813888888888889 | -0.256 |
| 0.8145833333333333 | -0.256 |
| 0.8152777777777778 | -0.256 |
| 0.8159722222222222 | -0.256 |
| 0.8166666666666668 | -0.256 |
| 0.8173611111111111 | -0.256 |
| 0.8180555555555555 | -0.256 |
| 0.81875 | -0.256 |
| 0.8194444444444445 | -0.256 |
| 0.8201388888888889 | -0.256 |
| 0.8208333333333333 | -0.256 |
| 0.8215277777777777 | -0.256 |
| 0.8222222222222223 | -0.256 |
| 0.8229166666666666 | -0.256 |
| 0.8236111111111111 | -0.256 |
| 0.8243055555555556 | -0.256 |
| 0.8250000000000001 | -0.256 |
| 0.8256944444444444 | -0.256 |
| 0.8263888888888888 | -0.256 |
| 0.8270833333333334 | -0.256 |
| 0.8277777777777778 | -0.256 |
| 0.8284722222222222 | -0.256 |
| 0.8291666666666666 | -0.256 |
| 0.8298611111111112 | -0.256 |
| 0.8305555555555556 | -0.256 |
| 0.8312499999999999 | -0.256 |
| 0.8319444444444444 | -0.256 |
| 0.8326388888888889 | -0.256 |
| 0.8333333333333334 | -0.256 |
| 0.8340277777777777 | -0.256 |
| 0.8347222222222223 | -0.256 |
| 0.8354166666666667 | -0.256 |
| 0.8361111111111111 | -0.256 |
| 0.8368055555555555 | -0.256 |
| 0.8375 | -0.256 |
| 0.8381944444444445 | -0.256 |
| 0.8388888888888889 | -0.256 |
| 0.8395833333333332 | -0.256 |
| 0.8402777777777778 | -0.256 |
| 0.8409722222222222 | -0.256 |
| 0.8416666666666667 | -0.256 |
| 0.842361111111111 | -0.256 |
| 0.8430555555555556 | -0.256 |
| 0.84375 | -0.256 |
| 0.8444444444444444 | -0.256 |
| 0.845138888888889 | -0.256 |
| 0.8458333333333333 | -0.256 |
| 0.8465277777777778 | -0.256 |
| 0.8472222222222222 | -0.256 |
| 0.8479166666666668 | -0.256 |
| 0.8486111111111111 | -0.256 |
| 0.8493055555555555 | -0.256 |
| 0.85 | -0.256 |
| 0.8506944444444445 | -0.256 |
| 0.8513888888888889 | -0.256 |
| 0.8520833333333333 | -0.256 |
| 0.8527777777777777 | -0.256 |
| 0.8534722222222223 | -0.256 |
| 0.8541666666666666 | -0.256 |
| 0.8548611111111111 | -0.256 |
| 0.8555555555555556 | -0.256 |
| 0.8562500000000001 | -0.256 |
| 0.8569444444444444 | -0.256 |
| 0.8576388888888888 | -0.256 |
| 0.8583333333333334 | -0.256 |
| 0.8590277777777778 | -0.256 |
| 0.8597222222222222 | -0.256 |
| 0.8604166666666666 | -0.256 |
| 0.8611111111111112 | -0.256 |
| 0.8618055555555556 | -0.256 |
| 0.8624999999999999 | -0.256 |
| 0.8631944444444444 | -0.256 |
| 0.8638888888888889 | -0.256 |
| 0.8645833333333334 | -0.256 |
| 0.8652777777777777 | -0.256 |
| 0.8659722222222223 | -0.256 |
| 0.8666666666666667 | -0.256 |
| 0.8673611111111111 | -0.256 |
| 0.8680555555555555 | -0.256 |
| 0.86875 | -0.256 |
| 0.8694444444444445 | -0.256 |
| 0.8701388888888889 | -0.256 |
| 0.8708333333333332 | -0.256 |
| 0.8715277777777778 | -0.256 |
| 0.8722222222222222 | -0.256 |
| 0.8729166666666667 | -0.256 |
| 0.873611111111111 | -0.256 |
| 0.8743055555555556 | -0.256 |
| 0.875 | -0.256 |
| 0.8756944444444444 | -0.256 |
| 0.876388888888889 | -0.256 |
| 0.8770833333333333 | -0.256 |
| 0.8777777777777778 | -0.256 |
| 0.8784722222222222 | -0.256 |
| 0.8791666666666668 | -0.256 |
| 0.8798611111111111 | -0.256 |
| 0.8805555555555555 | -0.256 |
| 0.88125 | -0.256 |
| 0.8819444444444445 | -0.256 |
| 0.8826388888888889 | -0.256 |
| 0.8833333333333333 | -0.256 |
| 0.8840277777777777 | -0.256 |
| 0.8847222222222223 | -0.256 |
| 0.8854166666666666 | -0.256 |
| 0.8861111111111111 | -0.256 |
| 0.8868055555555556 | -0.256 |
| 0.8875000000000001 | -0.256 |
| 0.8881944444444444 | -0.256 |
| 0.8888888888888888 | -0.256 |
| 0.8895833333333334 | -0.256 |
| 0.8902777777777778 | -0.256 |
| 0.8909722222222222 | -0.256 |
| 0.8916666666666666 | -0.256 |
| 0.8923611111111112 | -0.256 |
| 0.8930555555555556 | -0.256 |
| 0.8937499999999999 | -0.256 |
| 0.8944444444444444 | -0.256 |
| 0.8951388888888889 | -0.256 |
| 0.8958333333333334 | -0.256 |
| 0.8965277777777777 | -0.256 |
| 0.8972222222222223 | -0.256 |
| 0.8979166666666667 | -0.256 |
| 0.8986111111111111 | -0.256 |
| 0.8993055555555555 | -0.256 |
| 0.9 | -0.256 |
| 0.9006944444444445 | -0.256 |
| 0.9013888888888889 | -0.256 |
| 0.9020833333333332 | -0.256 |
| 0.9027777777777778 | -0.256 |
| 0.9034722222222222 | -0.256 |
| 0.9041666666666667 | -0.256 |
| 0.904861111111111 | -0.256 |
| 0.9055555555555556 | -0.256 |
| 0.90625 | -0.256 |
| 0.9069444444444444 | -0.256 |
| 0.907638888888889 | -0.256 |
| 0.9083333333333333 | -0.256 |
| 0.9090277777777778 | -0.256 |
| 0.9097222222222222 | -0.256 |
| 0.9104166666666668 | -0.256 |
| 0.9111111111111111 | -0.256 |
| 0.9118055555555555 | -0.256 |
| 0.9125 | -0.256 |
| 0.9131944444444445 | -0.256 |
| 0.9138888888888889 | -0.256 |
| 0.9145833333333333 | -0.256 |
| 0.9152777777777777 | -0.256 |
| 0.9159722222222223 | -0.256 |
| 0.9166666666666666 | -0.256 |
| 0.9173611111111111 | -0.256 |
| 0.9180555555555556 | -0.256 |
| 0.9187500000000001 | -0.256 |
| 0.9194444444444444 | -0.256 |
| 0.9201388888888888 | -0.256 |
| 0.9208333333333334 | -0.256 |
| 0.9215277777777778 | -0.256 |
| 0.9222222222222222 | -0.256 |
| 0.9229166666666666 | -0.256 |
| 0.9236111111111112 | -0.256 |
| 0.9243055555555556 | -0.256 |
| 0.9249999999999999 | -0.256 |
| 0.9256944444444444 | -0.256 |
| 0.9263888888888889 | -0.256 |
| 0.9270833333333334 | -0.256 |
| 0.9277777777777777 | -0.256 |
| 0.9284722222222223 | -0.256 |
| 0.9291666666666667 | -0.256 |
| 0.9298611111111111 | -0.256 |
| 0.9305555555555555 | -0.256 |
| 0.93125 | -0.256 |
| 0.9319444444444445 | -0.256 |
| 0.9326388888888889 | -0.256 |
| 0.9333333333333332 | -0.256 |
| 0.9340277777777778 | -0.256 |
| 0.9347222222222222 | -0.256 |
| 0.9354166666666667 | -0.256 |
| 0.936111111111111 | -0.256 |
| 0.9368055555555556 | -0.256 |
| 0.9375 | -0.256 |
| 0.9381944444444444 | -0.256 |
| 0.938888888888889 | -0.256 |
| 0.9395833333333333 | -0.256 |
| 0.9402777777777778 | -0.256 |
| 0.9409722222222222 | -0.256 |
| 0.9416666666666668 | -0.256 |
| 0.9423611111111111 | -0.256 |
| 0.9430555555555555 | -0.256 |
| 0.94375 | -0.256 |
| 0.9444444444444445 | -0.256 |
| 0.9451388888888889 | -0.256 |
| 0.9458333333333333 | -0.256 |
| 0.9465277777777777 | -0.256 |
| 0.9472222222222223 | -0.256 |
| 0.9479166666666666 | -0.256 |
| 0.9486111111111111 | -0.256 |
| 0.9493055555555556 | -0.256 |
| 0.9500000000000001 | -0.256 |
| 0.9506944444444444 | -0.256 |
| 0.9513888888888888 | -0.256 |
| 0.9520833333333334 | -0.256 |
| 0.9527777777777778 | -0.256 |
| 0.9534722222222222 | -0.256 |
| 0.9541666666666666 | -0.256 |
| 0.9548611111111112 | -0.256 |
| 0.9555555555555556 | -0.256 |
| 0.9562499999999999 | -0.256 |
| 0.9569444444444444 | -0.256 |
| 0.9576388888888889 | -0.256 |
| 0.9583333333333334 | -0.256 |
| 0.9590277777777777 | -0.256 |
| 0.9597222222222223 | -0.256 |
| 0.9604166666666667 | -0.256 |
| 0.9611111111111111 | -0.256 |
| 0.9618055555555555 | -0.256 |
| 0.9625 | -0.256 |
| 0.9631944444444445 | -0.256 |
| 0.9638888888888889 | -0.256 |
| 0.9645833333333332 | -0.256 |
| 0.9652777777777778 | -0.256 |
| 0.9659722222222222 | -0.256 |
| 0.9666666666666667 | -0.256 |
| 0.967361111111111 | -0.256 |
| 0.9680555555555556 | -0.256 |
| 0.96875 | -0.256 |
| 0.9694444444444444 | -0.256 |
| 0.970138888888889 | -0.256 |
| 0.9708333333333333 | -0.256 |
| 0.9715277777777778 | -0.256 |
| 0.9722222222222222 | -0.256 |
| 0.9729166666666668 | -0.256 |
| 0.9736111111111111 | -0.256 |
| 0.9743055555555555 | -0.256 |
| 0.975 | -0.256 |
| 0.9756944444444445 | -0.256 |
| 0.9763888888888889 | -0.256 |
| 0.9770833333333333 | -0.256 |
| 0.9777777777777777 | -0.256 |
| 0.9784722222222223 | -0.256 |
| 0.9791666666666666 | -0.256 |
| 0.9798611111111111 | -0.256 |
| 0.9805555555555556 | -0.256 |
| 0.9812500000000001 | -0.256 |
| 0.9819444444444444 | -0.256 |
| 0.9826388888888888 | -0.256 |
| 0.9833333333333334 | -0.256 |
| 0.9840277777777778 | -0.256 |
| 0.9847222222222222 | -0.256 |
| 0.9854166666666666 | -0.256 |
| 0.9861111111111112 | -0.256 |
| 0.9868055555555556 | -0.256 |
| 0.9874999999999999 | -0.256 |
| 0.9881944444444444 | -0.256 |
| 0.9888888888888889 | -0.256 |
| 0.9895833333333334 | -0.256 |
| 0.9902777777777777 | -0.256 |
| 0.9909722222222223 | -0.256 |
| 0.9916666666666667 | -0.256 |
| 0.9923611111111111 | -0.256 |
| 0.9930555555555555 | -0.256 |
| 0.99375 | -0.256 |
| 0.9944444444444445 | -0.256 |
| 0.9951388888888889 | -0.256 |
| 0.9958333333333332 | -0.256 |
| 0.9965277777777778 | -0.256 |
| 0.9972222222222222 | -0.256 |
| 0.9979166666666667 | -0.256 |
| 0.998611111111111 | -0.256 |
| 0.9993055555555556 | 0 |